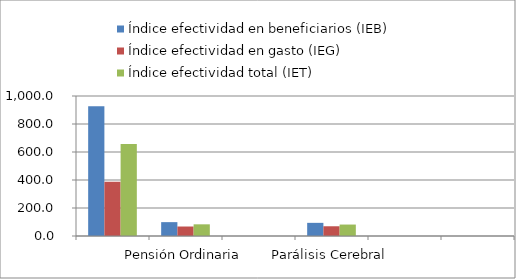
| Category | Índice efectividad en beneficiarios (IEB) | Índice efectividad en gasto (IEG)  | Índice efectividad total (IET) |
|---|---|---|---|
|  | 927.107 | 387.345 | 657.226 |
| Pensión Ordinaria | 99.016 | 67.77 | 83.393 |
|  | 0 | 0 | 0 |
| Parálisis Cerebral | 93.947 | 69.552 | 81.749 |